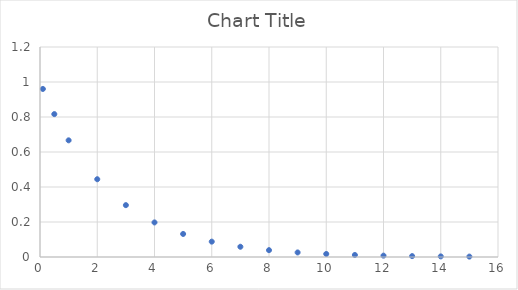
| Category | Series 0 |
|---|---|
| 0.1 | 0.96 |
| 0.5 | 0.816 |
| 1.0 | 0.667 |
| 2.0 | 0.444 |
| 3.0 | 0.296 |
| 4.0 | 0.198 |
| 5.0 | 0.132 |
| 6.0 | 0.088 |
| 7.0 | 0.059 |
| 8.0 | 0.039 |
| 9.0 | 0.026 |
| 10.0 | 0.017 |
| 11.0 | 0.012 |
| 12.0 | 0.008 |
| 13.0 | 0.005 |
| 14.0 | 0.003 |
| 15.0 | 0.002 |